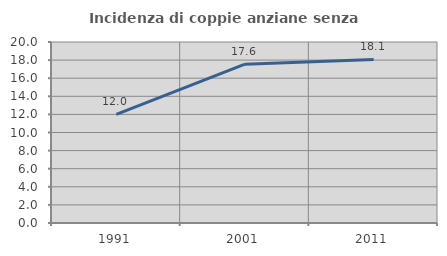
| Category | Incidenza di coppie anziane senza figli  |
|---|---|
| 1991.0 | 12 |
| 2001.0 | 17.553 |
| 2011.0 | 18.079 |